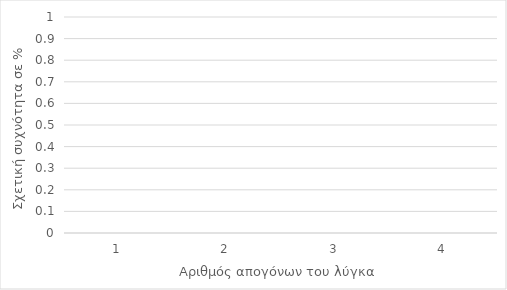
| Category | % |
|---|---|
| 1.0 | 0 |
| 2.0 | 0 |
| 3.0 | 0 |
| 4.0 | 0 |